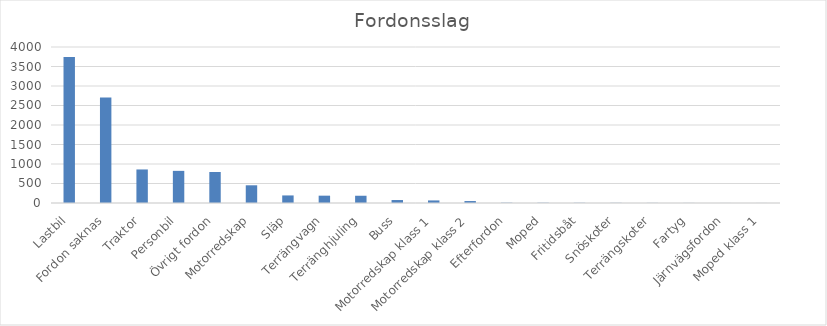
| Category | Summa |
|---|---|
| Lastbil | 3744 |
| Fordon saknas | 2704 |
| Traktor | 860 |
| Personbil | 824 |
| Övrigt fordon | 795 |
| Motorredskap | 454 |
| Släp | 194 |
| Terrängvagn | 188 |
| Terränghjuling | 186 |
| Buss | 76 |
| Motorredskap klass 1 | 66 |
| Motorredskap klass 2 | 50 |
| Efterfordon | 7 |
| Moped | 6 |
| Fritidsbåt | 5 |
| Snöskoter | 4 |
| Terrängskoter | 3 |
| Fartyg | 2 |
| Järnvägsfordon | 1 |
| Moped klass 1 | 1 |